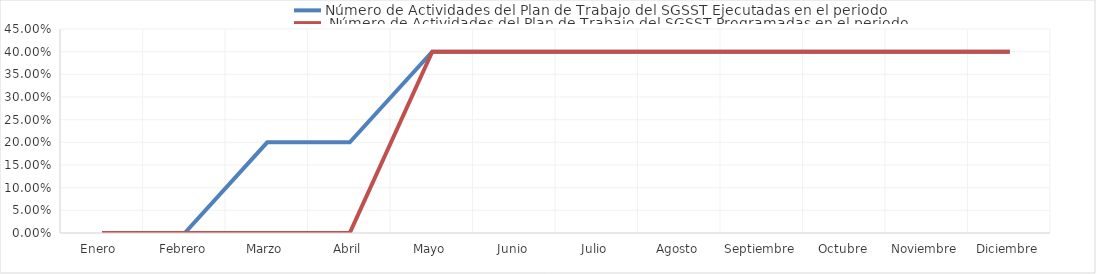
| Category | Número de Actividades del Plan de Trabajo del SGSST Ejecutadas en el periodo |  Número de Actividades del Plan de Trabajo del SGSST Programadas en el periodo |
|---|---|---|
| Enero  | 0 | 0 |
| Febrero | 0 | 0 |
| Marzo | 0.2 | 0 |
| Abril | 0.2 | 0 |
| Mayo | 0.4 | 0.4 |
| Junio | 0.4 | 0.4 |
| Julio | 0.4 | 0.4 |
| Agosto | 0.4 | 0.4 |
| Septiembre | 0.4 | 0.4 |
| Octubre | 0.4 | 0.4 |
| Noviembre | 0.4 | 0.4 |
| Diciembre | 0.4 | 0.4 |